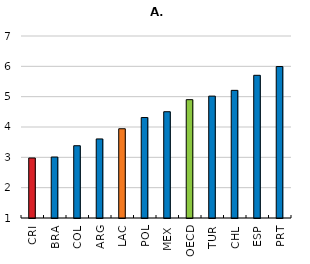
| Category | Quality of roads (1-7) |
|---|---|
| CRI | 2.978 |
| BRA | 3.01 |
| COL | 3.383 |
| ARG | 3.606 |
| LAC | 3.942 |
| POL | 4.312 |
| MEX | 4.503 |
| OECD | 4.901 |
| TUR | 5.018 |
| CHL | 5.208 |
| ESP | 5.704 |
| PRT | 5.993 |